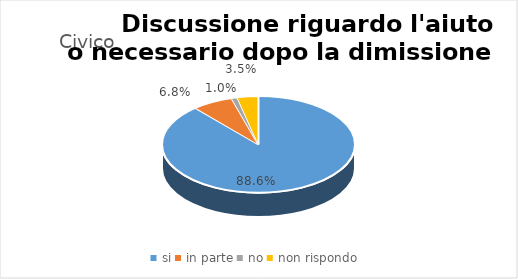
| Category | Civico - Osp -  Palermo - PA |
|---|---|
| si | 0.886 |
| in parte | 0.068 |
| no | 0.01 |
| non rispondo | 0.035 |